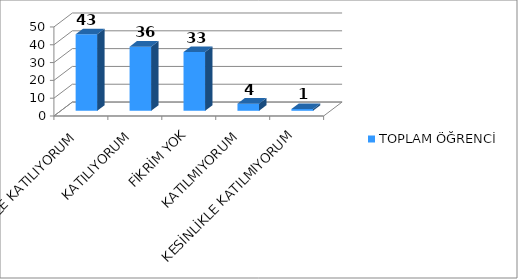
| Category | TOPLAM ÖĞRENCİ |
|---|---|
| KESİNLİKLE KATILIYORUM | 43 |
| KATILIYORUM | 36 |
| FİKRİM YOK | 33 |
| KATILMIYORUM | 4 |
| KESİNLİKLE KATILMIYORUM | 1 |